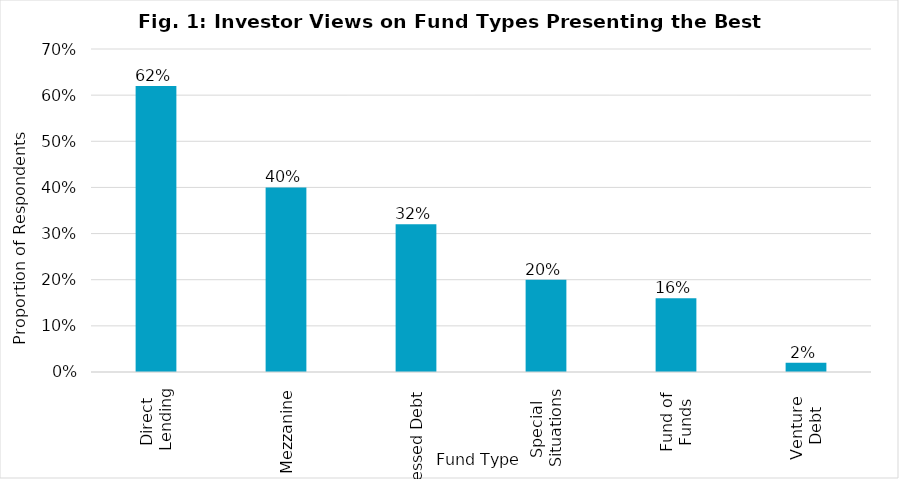
| Category | Proportion of Respondents |
|---|---|
| Direct 
Lending | 0.62 |
| Mezzanine | 0.4 |
| Distressed Debt | 0.32 |
| Special 
Situations | 0.2 |
| Fund of
Funds | 0.16 |
| Venture 
Debt | 0.02 |